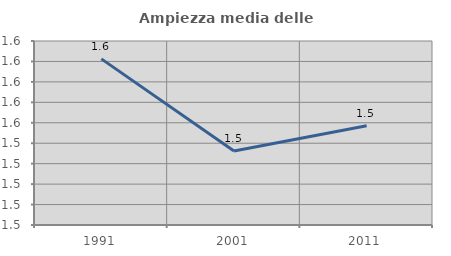
| Category | Ampiezza media delle famiglie |
|---|---|
| 1991.0 | 1.612 |
| 2001.0 | 1.522 |
| 2011.0 | 1.547 |